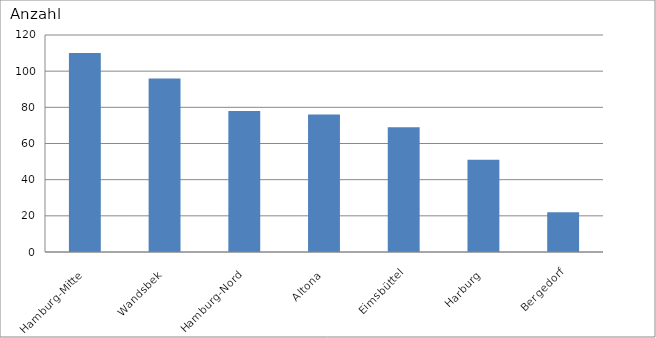
| Category | Hamburg-Mitte |
|---|---|
| Hamburg-Mitte | 110 |
| Wandsbek | 96 |
| Hamburg-Nord | 78 |
| Altona | 76 |
| Eimsbüttel | 69 |
| Harburg | 51 |
| Bergedorf | 22 |